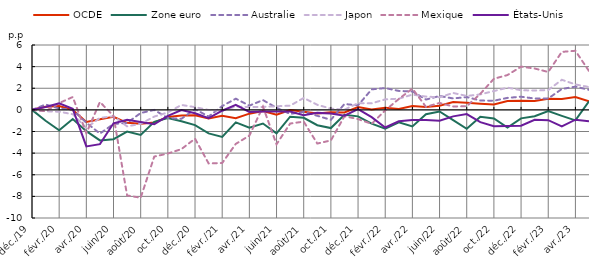
| Category | OCDE | Zone euro | Australie | Japon | Mexique | États-Unis |
|---|---|---|---|---|---|---|
| 2019-12-01 | 0 | 0 | 0 | 0 | 0 | 0 |
| 2020-01-01 | 0.289 | -1.005 | 0.497 | -0.131 | -0.124 | 0.259 |
| 2020-02-01 | 0.349 | -1.886 | 0.132 | -0.17 | 0.631 | 0.605 |
| 2020-03-01 | -0.006 | -0.84 | 0.009 | -0.402 | 1.19 | 0.095 |
| 2020-04-01 | -1.121 | -1.971 | -1.183 | -1.669 | -2.155 | -3.379 |
| 2020-05-01 | -0.864 | -2.824 | -2.194 | -0.743 | 0.729 | -3.167 |
| 2020-06-01 | -0.641 | -2.712 | -1.306 | -0.59 | -0.564 | -1.238 |
| 2020-07-01 | -1.202 | -2.011 | -1.203 | -1.525 | -7.915 | -0.907 |
| 2020-08-01 | -1.293 | -2.314 | -0.291 | -1.288 | -8.128 | -1.116 |
| 2020-09-01 | -1.166 | -1.106 | -0.004 | -0.619 | -4.32 | -1.33 |
| 2020-10-01 | -0.668 | -0.746 | -0.754 | -0.237 | -4.039 | -0.55 |
| 2020-11-01 | -0.524 | -1.055 | -0.825 | 0.456 | -3.626 | -0.008 |
| 2020-12-01 | -0.492 | -1.405 | 0.064 | 0.252 | -2.665 | -0.311 |
| 2021-01-01 | -0.791 | -2.175 | -0.616 | -0.008 | -4.95 | -0.766 |
| 2021-02-01 | -0.55 | -2.502 | 0.353 | -0.081 | -4.916 | -0.079 |
| 2021-03-01 | -0.77 | -1.152 | 1.035 | 0.318 | -3.144 | 0.465 |
| 2021-04-01 | -0.351 | -1.65 | 0.393 | 0.261 | -2.382 | -0.192 |
| 2021-05-01 | -0.113 | -1.263 | 0.905 | 0.275 | 0.298 | -0.143 |
| 2021-06-01 | -0.442 | -2.169 | 0.194 | 0.333 | -3.186 | -0.156 |
| 2021-07-01 | -0.01 | -0.631 | -0.376 | 0.39 | -1.266 | -0.161 |
| 2021-08-01 | -0.179 | -0.737 | -0.181 | 1.101 | -1.086 | -0.499 |
| 2021-09-01 | -0.327 | -1.418 | -0.548 | 0.468 | -3.114 | -0.278 |
| 2021-10-01 | -0.214 | -1.684 | -0.92 | 0.118 | -2.824 | -0.345 |
| 2021-11-01 | -0.237 | -0.456 | 0.544 | 0.018 | -0.587 | -0.544 |
| 2021-12-01 | 0.259 | -0.599 | 0.418 | 0.624 | -0.853 | 0.071 |
| 2022-01-01 | 0.041 | -1.271 | 1.896 | 0.606 | -1.29 | -0.678 |
| 2022-02-01 | 0.186 | -1.741 | 2.017 | 0.97 | -0.048 | -1.628 |
| 2022-03-01 | 0.09 | -1.155 | 1.752 | 1.035 | 1.007 | -1.057 |
| 2022-04-01 | 0.355 | -1.53 | 1.703 | 1.411 | 1.967 | -0.937 |
| 2022-05-01 | 0.274 | -0.406 | 0.955 | 1.227 | 0.279 | -0.933 |
| 2022-06-01 | 0.376 | -0.152 | 1.286 | 1.166 | 0.642 | -1.011 |
| 2022-07-01 | 0.727 | -0.951 | 1.057 | 1.564 | 0.315 | -0.602 |
| 2022-08-01 | 0.656 | -1.751 | 1.186 | 1.286 | 0.336 | -0.384 |
| 2022-09-01 | 0.563 | -0.643 | 0.866 | 1.431 | 1.485 | -1.132 |
| 2022-10-01 | 0.494 | -0.801 | 0.848 | 1.743 | 2.878 | -1.512 |
| 2022-11-01 | 0.82 | -1.644 | 1.109 | 2.056 | 3.221 | -1.482 |
| 2022-12-01 | 0.855 | -0.786 | 1.217 | 1.816 | 3.999 | -1.469 |
| 2023-01-01 | 0.825 | -0.585 | 1.05 | 1.787 | 3.828 | -0.921 |
| 2023-02-01 | 1.023 | -0.12 | 1.054 | 1.838 | 3.506 | -0.95 |
| 2023-03-01 | 0.999 | -0.557 | 1.928 | 2.784 | 5.363 | -1.523 |
| 2023-04-01 | 1.196 | -0.967 | 2.15 | 2.351 | 5.465 | -0.91 |
| 2023-05-01 | 0.786 | 0.791 | 1.851 | 2.113 | 3.589 | -1.054 |